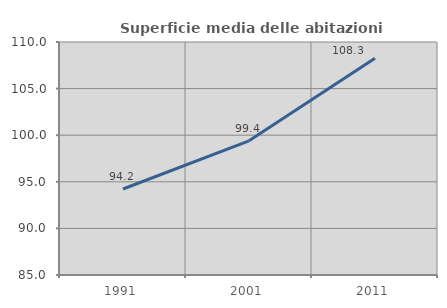
| Category | Superficie media delle abitazioni occupate |
|---|---|
| 1991.0 | 94.228 |
| 2001.0 | 99.393 |
| 2011.0 | 108.261 |